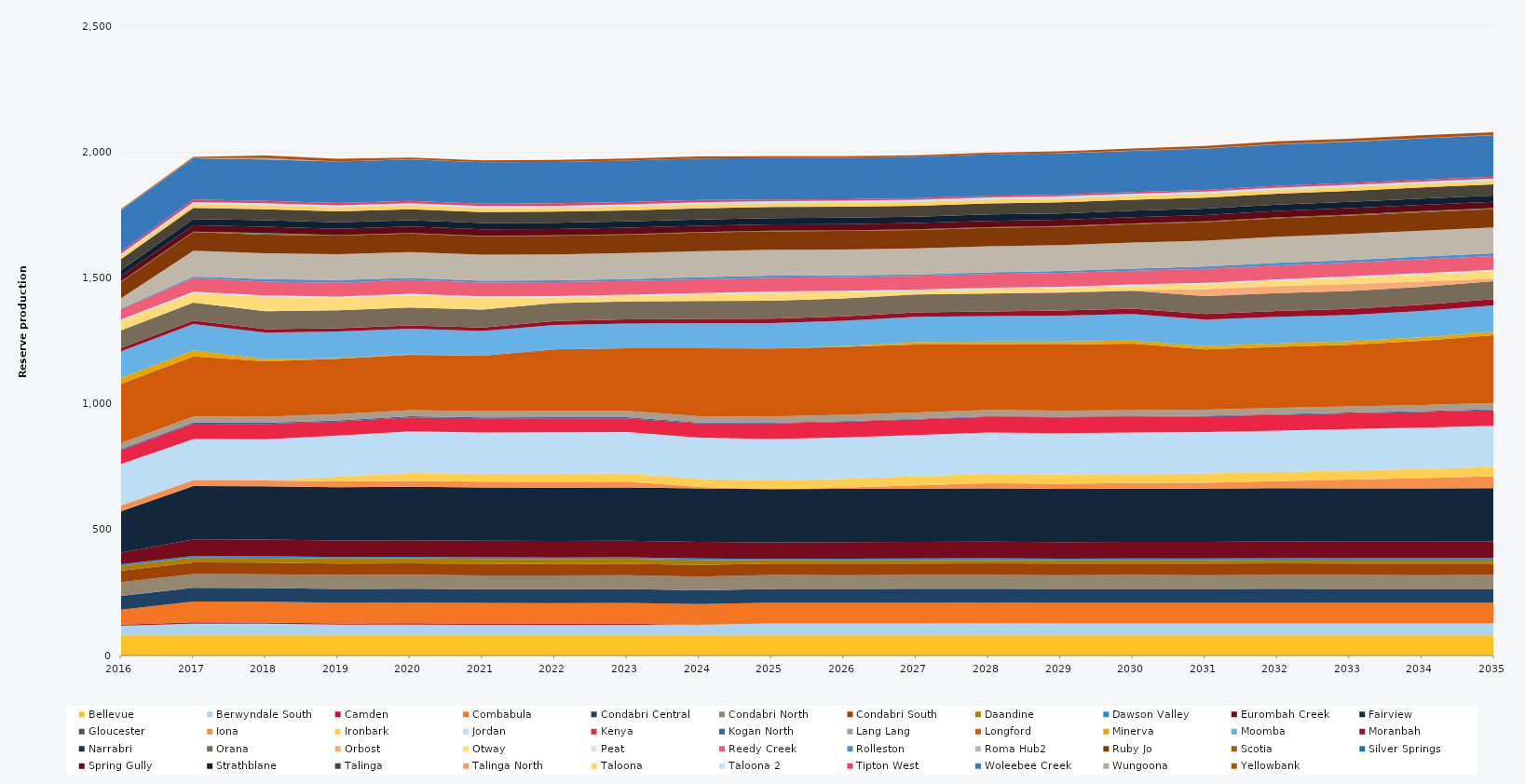
| Category | Bellevue | Berwyndale South | Camden | Combabula | Condabri Central | Condabri North | Condabri South | Daandine | Dawson Valley | Eurombah Creek | Fairview | Gloucester | Iona | Ironbark | Jordan | Kenya | Kogan North | Lang Lang | Longford | Minerva | Moomba | Moranbah | Narrabri | Orana | Orbost | Otway | Peat | Reedy Creek | Rolleston | Roma Hub2 | Ruby Jo | Scotia | Silver Springs | Spring Gully | Strathblane | Talinga | Talinga North | Taloona | Taloona 2 | Tipton West | Woleebee Creek | Wungoona | Yellowbank |
|---|---|---|---|---|---|---|---|---|---|---|---|---|---|---|---|---|---|---|---|---|---|---|---|---|---|---|---|---|---|---|---|---|---|---|---|---|---|---|---|---|---|---|---|
| 2016 | 80.52 | 37.896 | 5 | 58.98 | 54.423 | 54.338 | 45.269 | 20.13 | 5.856 | 45.979 | 165.136 | 0 | 23.12 | 0 | 164.7 | 54.027 | 4.392 | 24.522 | 235.041 | 23.79 | 105 | 13.077 | 0 | 70.775 | 0 | 38 | 5.49 | 39.933 | 2.859 | 41.102 | 64.014 | 1.416 | 0.628 | 22.937 | 23.146 | 43.156 | 0 | 13.458 | 7.461 | 9.516 | 164.7 | 1.543 | 2.82 |
| 2017 | 80.3 | 46.821 | 5 | 82.125 | 54.75 | 54.75 | 45.625 | 20.075 | 5.84 | 65.7 | 211.7 | 0 | 23.12 | 0 | 164.25 | 60.831 | 4.38 | 24.455 | 238.456 | 23.725 | 105 | 13.709 | 0 | 71.175 | 0 | 38 | 5.475 | 54.75 | 4.801 | 102.93 | 73.702 | 1.668 | 0.316 | 25.185 | 25.185 | 43.8 | 0 | 15.33 | 8.395 | 9.49 | 164.25 | 0.712 | 4.935 |
| 2018 | 80.3 | 46.07 | 5 | 82.125 | 54.75 | 54.75 | 45.625 | 20.075 | 5.84 | 65.7 | 211.7 | 0 | 23.12 | 0 | 164.25 | 60.651 | 4.38 | 24.455 | 220 | 8.546 | 105 | 14.12 | 0 | 71.175 | 0 | 57.157 | 5.475 | 54.75 | 9.949 | 102.93 | 73.702 | 4.275 | 2.365 | 25.185 | 25.185 | 43.8 | 0 | 15.33 | 8.395 | 9.49 | 164.25 | 6.326 | 9.563 |
| 2019 | 80.3 | 42.532 | 5 | 82.125 | 54.75 | 54.75 | 45.625 | 20.075 | 5.84 | 65.7 | 211.7 | 0 | 23.12 | 18.25 | 164.25 | 55.56 | 4.38 | 24.455 | 220 | 3.197 | 105 | 13.353 | 0 | 71.175 | 0 | 48.95 | 5.475 | 54.75 | 10.947 | 102.93 | 73.702 | 1.849 | 0.129 | 25.185 | 25.185 | 43.8 | 0 | 15.33 | 8.395 | 9.49 | 164.25 | 0.291 | 10.95 |
| 2020 | 80.52 | 42.747 | 5 | 82.35 | 54.9 | 54.9 | 45.75 | 20.13 | 5.856 | 65.88 | 212.28 | 0 | 23.12 | 31.776 | 164.7 | 55.869 | 4.392 | 24.522 | 220 | 1.492 | 101.757 | 13.322 | 0 | 71.37 | 0 | 48.95 | 5.49 | 54.9 | 7.371 | 103.212 | 73.873 | 1.817 | 0.012 | 25.254 | 25.254 | 43.92 | 0 | 15.372 | 8.418 | 9.516 | 164.7 | 0.042 | 7.353 |
| 2021 | 80.3 | 41.34 | 5 | 82.125 | 54.75 | 54.75 | 45.625 | 20.075 | 5.84 | 65.7 | 211.7 | 0 | 23.12 | 31.317 | 164.25 | 55.94 | 4.38 | 24.455 | 220 | 0 | 98.579 | 13.827 | 0 | 71.175 | 0 | 46.591 | 5.475 | 54.75 | 7.887 | 102.93 | 73.674 | 1.763 | 0.024 | 25.185 | 25.185 | 43.8 | 0 | 15.33 | 8.395 | 9.49 | 164.25 | 0.026 | 7.951 |
| 2022 | 80.3 | 40.993 | 5 | 82.125 | 54.75 | 54.75 | 45.625 | 20.075 | 5.84 | 65.7 | 211.7 | 0 | 23.12 | 32.138 | 164.25 | 56.183 | 4.38 | 24.455 | 244.607 | 0 | 97.216 | 15.298 | 0 | 71.175 | 0 | 22.645 | 5.475 | 54.75 | 7.654 | 102.93 | 73.63 | 1.83 | 0.012 | 25.185 | 25.185 | 43.8 | 0 | 15.33 | 8.395 | 9.49 | 164.25 | 0.03 | 7.806 |
| 2023 | 80.3 | 41.798 | 5 | 82.125 | 54.75 | 54.75 | 45.625 | 20.075 | 5.84 | 65.7 | 211.7 | 0 | 23.12 | 32.092 | 164.25 | 55.403 | 4.38 | 24.455 | 249.161 | 0 | 98.292 | 16.264 | 0 | 71.175 | 0 | 20.87 | 5.475 | 54.75 | 8.026 | 102.93 | 73.586 | 1.995 | 0.012 | 25.185 | 25.185 | 43.8 | 0 | 15.33 | 8.395 | 9.49 | 164.25 | 0.03 | 7.968 |
| 2024 | 80.52 | 41.117 | 0 | 82.35 | 54.9 | 54.9 | 45.75 | 20.13 | 5.856 | 65.88 | 212.28 | 0 | 5.3 | 31.833 | 164.7 | 55.841 | 4.392 | 24.522 | 270 | 0 | 100.02 | 16.79 | 0 | 71.37 | 0 | 25.634 | 5.49 | 54.9 | 8.254 | 103.212 | 73.713 | 1.867 | 0.03 | 25.254 | 25.254 | 43.92 | 0 | 15.372 | 8.418 | 9.516 | 164.7 | 0.06 | 8.12 |
| 2025 | 80.3 | 47.635 | 0 | 82.125 | 54.75 | 54.75 | 45.625 | 12.711 | 5.84 | 65.7 | 211.7 | 0 | 0 | 34.683 | 164.25 | 61.86 | 2.861 | 24.455 | 270 | 0 | 101.039 | 17.268 | 0 | 71.175 | 0 | 32.023 | 5.475 | 54.75 | 7.456 | 102.93 | 73.498 | 2.165 | 0.081 | 25.185 | 25.185 | 43.8 | 0 | 15.33 | 8.395 | 6.463 | 164.25 | 0.191 | 7.388 |
| 2026 | 80.3 | 47.44 | 0 | 82.125 | 54.75 | 54.75 | 45.625 | 13.616 | 5.84 | 65.7 | 211.7 | 0 | 4.918 | 35.404 | 164.25 | 62.058 | 2.904 | 24.455 | 270 | 3.177 | 100.577 | 17.518 | 0 | 71.175 | 0.185 | 24.92 | 5.475 | 54.75 | 6.118 | 102.93 | 73.455 | 2.063 | 0.084 | 25.185 | 25.185 | 43.8 | 0 | 15.33 | 8.395 | 6.321 | 164.25 | 0.229 | 5.963 |
| 2027 | 80.3 | 47.733 | 0 | 82.125 | 54.75 | 54.75 | 45.625 | 14.089 | 5.84 | 65.7 | 211.7 | 0 | 13.04 | 36.016 | 164.25 | 61.75 | 2.778 | 24.455 | 270 | 9.54 | 100.606 | 18.14 | 0 | 71.175 | 0.225 | 13.009 | 5.475 | 54.75 | 6.068 | 102.93 | 73.411 | 2.224 | 0.074 | 25.185 | 25.185 | 43.8 | 0 | 15.33 | 8.395 | 6.264 | 164.25 | 0.204 | 6.071 |
| 2028 | 80.52 | 47.648 | 0 | 82.35 | 54.9 | 54.9 | 45.75 | 14.193 | 5.856 | 65.88 | 212.28 | 0 | 19.83 | 36.6 | 164.7 | 62.129 | 3.027 | 24.522 | 260.611 | 11.173 | 100.844 | 18.99 | 0 | 71.37 | 0.21 | 16.995 | 5.49 | 54.9 | 6.196 | 103.212 | 73.537 | 2.336 | 0.207 | 25.254 | 25.254 | 43.92 | 0 | 15.372 | 8.418 | 6.25 | 164.7 | 0.433 | 6.418 |
| 2029 | 80.3 | 47.46 | 0 | 82.125 | 54.75 | 54.75 | 45.625 | 13.929 | 5.84 | 65.7 | 211.7 | 0 | 20.409 | 36.5 | 164.25 | 62.039 | 2.883 | 24.455 | 262.304 | 12.134 | 103.011 | 20.344 | 0 | 71.175 | 1.542 | 16.187 | 5.475 | 54.75 | 7.334 | 102.93 | 73.323 | 2.267 | 0.322 | 25.185 | 25.185 | 43.8 | 0 | 15.33 | 8.395 | 6.541 | 164.25 | 0.734 | 7.386 |
| 2030 | 80.3 | 47.7 | 0 | 82.125 | 54.75 | 54.75 | 45.625 | 14.285 | 5.84 | 65.7 | 211.7 | 0 | 22.229 | 36.5 | 164.25 | 61.8 | 2.933 | 24.455 | 264.048 | 12.051 | 105 | 21.608 | 0 | 71.175 | 1.592 | 18 | 5.475 | 54.75 | 8.278 | 102.93 | 73.279 | 2.649 | 0.4 | 25.185 | 25.185 | 43.8 | 0 | 15.33 | 8.395 | 6.384 | 164.25 | 1.027 | 8.244 |
| 2031 | 80.3 | 47.42 | 0 | 82.125 | 54.75 | 54.75 | 45.625 | 14.439 | 5.84 | 65.7 | 211.7 | 0 | 23.78 | 36.5 | 164.25 | 62.075 | 3.057 | 24.455 | 239.416 | 13.004 | 105 | 22.555 | 0 | 71.175 | 27.375 | 19.749 | 5.475 | 54.75 | 9.668 | 102.93 | 73.235 | 2.929 | 0.37 | 25.185 | 25.185 | 43.8 | 0 | 15.33 | 8.395 | 6.68 | 164.25 | 1.08 | 9.482 |
| 2032 | 80.52 | 47.335 | 0 | 82.35 | 54.9 | 54.9 | 45.75 | 15.176 | 5.856 | 65.88 | 212.28 | 0 | 27.318 | 36.6 | 164.7 | 62.454 | 2.932 | 24.522 | 242.918 | 13.5 | 105 | 23.473 | 0 | 71.37 | 27.45 | 21.476 | 5.49 | 54.9 | 10.98 | 103.212 | 73.361 | 3.195 | 0.451 | 25.254 | 25.254 | 43.92 | 0 | 15.372 | 8.418 | 7.163 | 164.7 | 1.303 | 10.98 |
| 2033 | 80.3 | 47.708 | 0 | 82.125 | 54.75 | 54.75 | 45.625 | 15.716 | 5.84 | 65.7 | 211.7 | 0 | 34.706 | 36.5 | 164.25 | 61.78 | 3.376 | 24.455 | 245.205 | 13.427 | 105 | 23.984 | 0 | 71.175 | 27.375 | 25.233 | 5.475 | 54.75 | 10.338 | 102.93 | 73.147 | 3.525 | 0.648 | 25.185 | 25.185 | 43.8 | 0 | 15.33 | 8.395 | 7.2 | 164.25 | 1.479 | 10.209 |
| 2034 | 80.3 | 47.42 | 0 | 82.125 | 54.75 | 54.75 | 45.625 | 16.06 | 5.84 | 65.7 | 211.7 | 0 | 40.077 | 36.5 | 164.25 | 62.07 | 3.318 | 24.455 | 255.21 | 13.577 | 105 | 24.559 | 0 | 71.175 | 20.902 | 28.12 | 5.475 | 54.75 | 10.852 | 102.93 | 73.103 | 3.708 | 0.639 | 25.185 | 25.185 | 43.8 | 0 | 15.33 | 8.395 | 7.1 | 164.25 | 1.494 | 10.835 |
| 2035 | 80.3 | 47.54 | 0 | 82.125 | 54.75 | 54.75 | 45.625 | 16.191 | 5.84 | 65.7 | 211.7 | 0 | 47.799 | 36.5 | 164.25 | 61.96 | 3.299 | 24.455 | 269.734 | 13.671 | 105 | 24.812 | 0 | 71.175 | 10.215 | 29.089 | 5.475 | 54.75 | 10.95 | 102.93 | 72.753 | 3.192 | 0.593 | 25.185 | 25.185 | 43.8 | 0 | 15.33 | 8.395 | 6.903 | 164.25 | 1.502 | 10.95 |